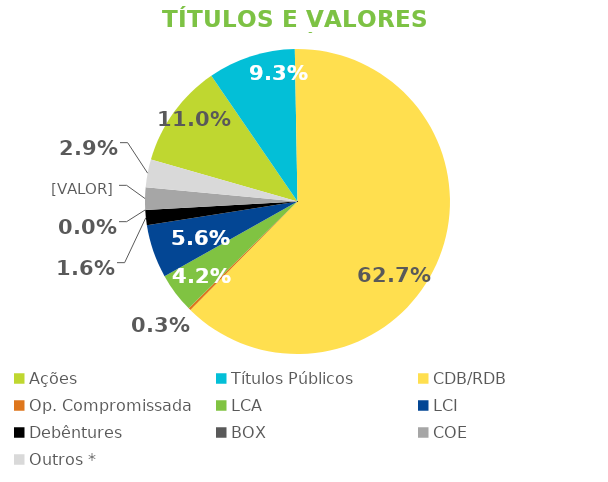
| Category | TVM |
|---|---|
| Ações | 0.11 |
| Títulos Públicos | 0.093 |
| CDB/RDB | 0.627 |
| Op. Compromissada | 0.003 |
| LCA | 0.042 |
| LCI | 0.056 |
| Debêntures | 0.016 |
| BOX | 0 |
| COE | 0.024 |
| Outros * | 0.029 |